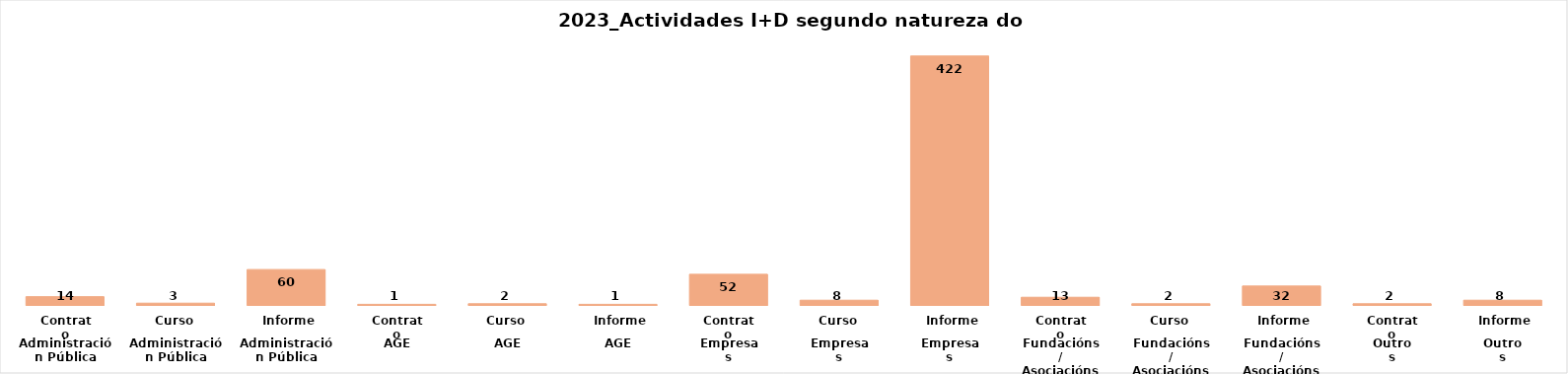
| Category | Series 0 |
|---|---|
| 0 | 14 |
| 1 | 3 |
| 2 | 60 |
| 3 | 1 |
| 4 | 2 |
| 5 | 1 |
| 6 | 52 |
| 7 | 8 |
| 8 | 422 |
| 9 | 13 |
| 10 | 2 |
| 11 | 32 |
| 12 | 2 |
| 13 | 8 |